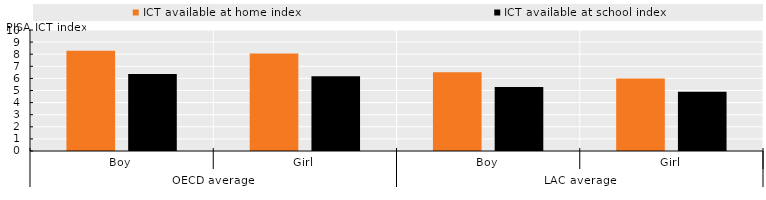
| Category | ICT available at home index | ICT available at school index |
|---|---|---|
| 0 | 8.289 | 6.366 |
| 1 | 8.051 | 6.178 |
| 2 | 6.512 | 5.279 |
| 3 | 5.99 | 4.898 |